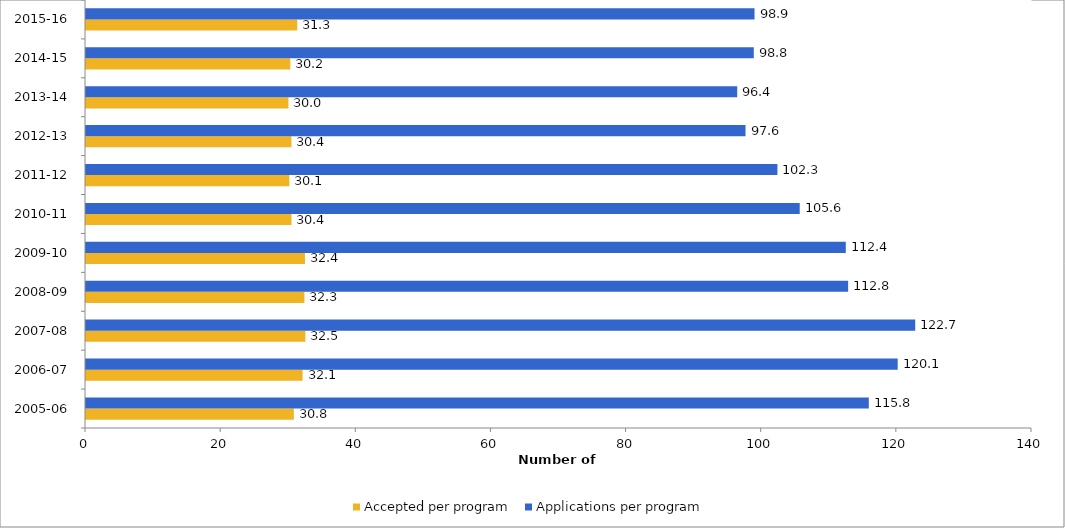
| Category | Accepted per program | Applications per program |
|---|---|---|
| 2005-06 | 30.758 | 115.849 |
| 2006-07 | 32.052 | 120.126 |
| 2007-08 | 32.468 | 122.717 |
| 2008-09 | 32.326 | 112.791 |
| 2009-10 | 32.405 | 112.443 |
| 2010-11 | 30.406 | 105.625 |
| 2011-12 | 30.096 | 102.325 |
| 2012-13 | 30.403 | 97.603 |
| 2013-14 | 29.955 | 96.374 |
| 2014-15 | 30.236 | 98.827 |
| 2015-16 | 31.266 | 98.937 |